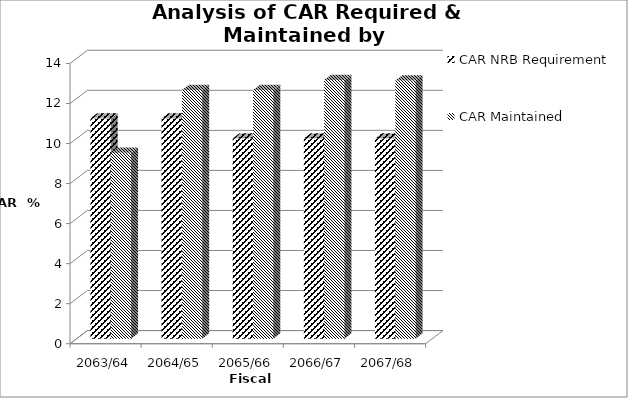
| Category | CAR NRB Requirement | CAR Maintained |
|---|---|---|
| 2063/64 | 11 | 9.288 |
| 2064/65 | 11 | 12.414 |
| 2065/66 | 10 | 12.419 |
| 2066/67 | 10 | 12.922 |
| 2067/68 | 10 | 12.891 |